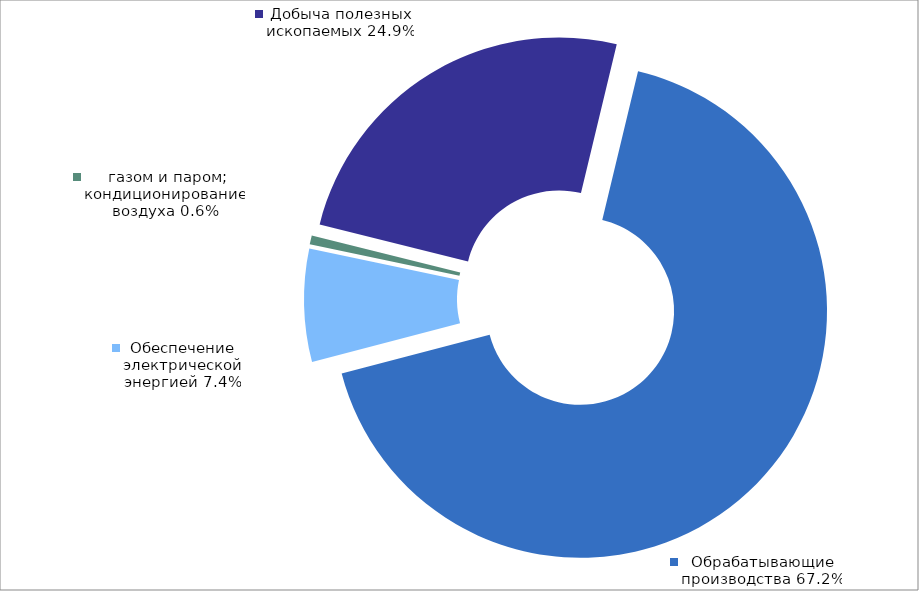
| Category | Итог |
|---|---|
| Добыча полезных ископаемых | 0.249 |
| Обрабатывающие производства | 0.672 |
| Обеспечение электрической энергией, газом и паром; кондиционирование воздуха | 0.074 |
| Водоснабжение; водоотведение, организация сбора и утилизации отходов, деятельность по ликвидации загрязнений | 0.006 |